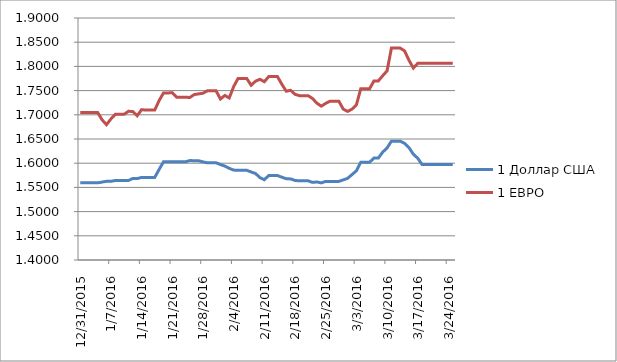
| Category | 1 Доллар США | 1 ЕВРО |
|---|---|---|
| 12/31/15 | 1.559 | 1.705 |
| 1/1/16 | 1.559 | 1.705 |
| 1/2/16 | 1.559 | 1.705 |
| 1/3/16 | 1.559 | 1.705 |
| 1/4/16 | 1.559 | 1.705 |
| 1/5/16 | 1.561 | 1.69 |
| 1/6/16 | 1.563 | 1.68 |
| 1/7/16 | 1.563 | 1.691 |
| 1/8/16 | 1.564 | 1.701 |
| 1/9/16 | 1.564 | 1.701 |
| 1/10/16 | 1.564 | 1.701 |
| 1/11/16 | 1.564 | 1.707 |
| 1/12/16 | 1.568 | 1.707 |
| 1/13/16 | 1.568 | 1.698 |
| 1/14/16 | 1.571 | 1.711 |
| 1/15/16 | 1.571 | 1.71 |
| 1/16/16 | 1.571 | 1.71 |
| 1/17/16 | 1.571 | 1.71 |
| 1/18/16 | 1.587 | 1.729 |
| 1/19/16 | 1.603 | 1.745 |
| 1/20/16 | 1.603 | 1.745 |
| 1/21/16 | 1.603 | 1.746 |
| 1/22/16 | 1.603 | 1.736 |
| 1/23/16 | 1.603 | 1.736 |
| 1/24/16 | 1.603 | 1.736 |
| 1/25/16 | 1.605 | 1.736 |
| 1/26/16 | 1.605 | 1.742 |
| 1/27/16 | 1.605 | 1.743 |
| 1/28/16 | 1.603 | 1.744 |
| 1/29/16 | 1.601 | 1.75 |
| 1/30/16 | 1.601 | 1.75 |
| 1/31/16 | 1.601 | 1.75 |
| 2/1/16 | 1.597 | 1.733 |
| 2/2/16 | 1.594 | 1.74 |
| 2/3/16 | 1.589 | 1.735 |
| 2/4/16 | 1.586 | 1.758 |
| 2/5/16 | 1.585 | 1.775 |
| 2/6/16 | 1.585 | 1.775 |
| 2/7/16 | 1.585 | 1.775 |
| 2/8/16 | 1.582 | 1.761 |
| 2/9/16 | 1.579 | 1.77 |
| 2/10/16 | 1.57 | 1.773 |
| 2/11/16 | 1.566 | 1.768 |
| 2/12/16 | 1.574 | 1.779 |
| 2/13/16 | 1.574 | 1.779 |
| 2/14/16 | 1.574 | 1.779 |
| 2/15/16 | 1.571 | 1.763 |
| 2/16/16 | 1.568 | 1.749 |
| 2/17/16 | 1.568 | 1.751 |
| 2/18/16 | 1.564 | 1.742 |
| 2/19/16 | 1.564 | 1.74 |
| 2/20/16 | 1.564 | 1.74 |
| 2/21/16 | 1.564 | 1.74 |
| 2/22/16 | 1.56 | 1.734 |
| 2/23/16 | 1.561 | 1.724 |
| 2/24/16 | 1.559 | 1.718 |
| 2/25/16 | 1.562 | 1.724 |
| 2/26/16 | 1.562 | 1.728 |
| 2/27/16 | 1.562 | 1.728 |
| 2/28/16 | 1.562 | 1.728 |
| 2/29/16 | 1.566 | 1.712 |
| 3/1/16 | 1.569 | 1.707 |
| 3/2/16 | 1.576 | 1.712 |
| 3/3/16 | 1.584 | 1.72 |
| 3/4/16 | 1.602 | 1.754 |
| 3/5/16 | 1.602 | 1.754 |
| 3/6/16 | 1.602 | 1.754 |
| 3/7/16 | 1.61 | 1.77 |
| 3/8/16 | 1.61 | 1.77 |
| 3/9/16 | 1.623 | 1.781 |
| 3/10/16 | 1.632 | 1.791 |
| 3/11/16 | 1.646 | 1.838 |
| 3/12/16 | 1.646 | 1.838 |
| 3/13/16 | 1.646 | 1.838 |
| 3/14/16 | 1.641 | 1.832 |
| 3/15/16 | 1.632 | 1.813 |
| 3/16/16 | 1.619 | 1.797 |
| 3/17/16 | 1.61 | 1.806 |
| 3/18/16 | 1.597 | 1.807 |
| 3/19/16 | 1.597 | 1.807 |
| 3/20/16 | 1.597 | 1.807 |
| 3/21/16 | 1.597 | 1.807 |
| 3/22/16 | 1.597 | 1.807 |
| 3/23/16 | 1.597 | 1.807 |
| 3/24/16 | 1.597 | 1.807 |
| 3/25/16 | 1.597 | 1.807 |